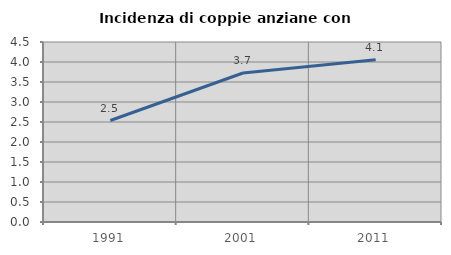
| Category | Incidenza di coppie anziane con figli |
|---|---|
| 1991.0 | 2.537 |
| 2001.0 | 3.725 |
| 2011.0 | 4.058 |